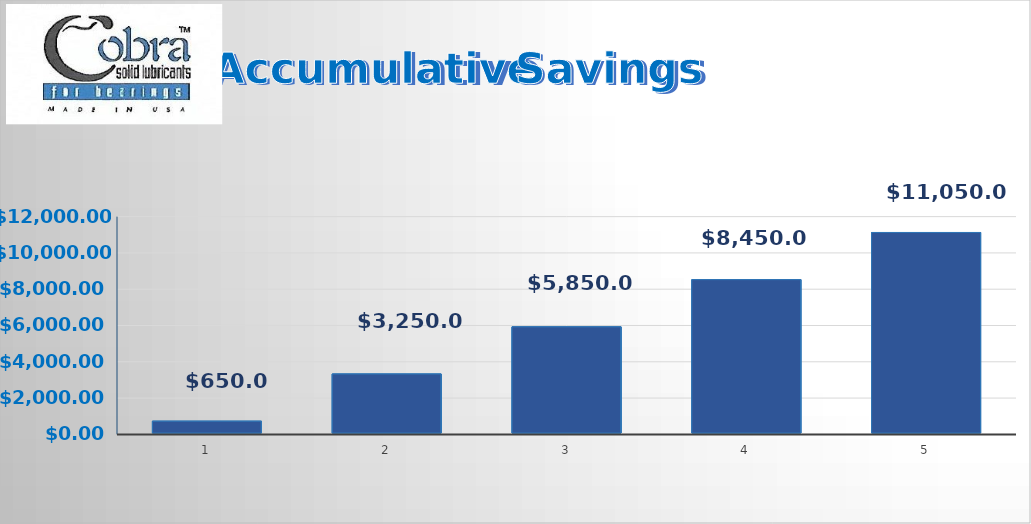
| Category | Series 0 |
|---|---|
| 0 | 650 |
| 1 | 3250 |
| 2 | 5850 |
| 3 | 8450 |
| 4 | 11050 |